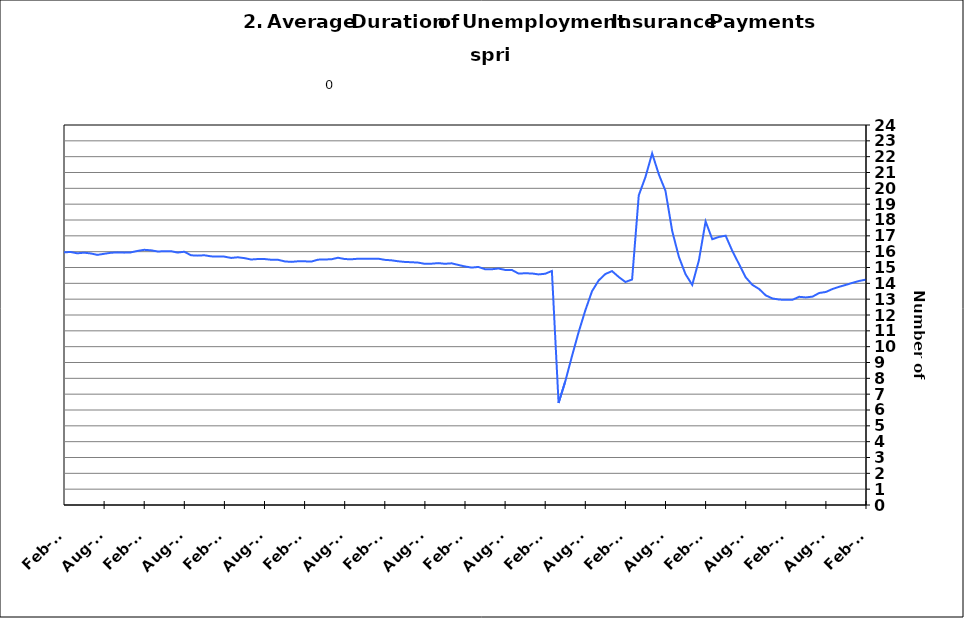
| Category | Average Duration |
|---|---|
| 1995-01-31 | 14.777 |
| 1995-02-28 | 14.761 |
| 1995-03-31 | 14.672 |
| 1995-04-30 | 14.601 |
| 1995-05-31 | 14.598 |
| 1995-06-30 | 14.51 |
| 1995-07-31 | 14.501 |
| 1995-08-31 | 14.41 |
| 1995-09-30 | 14.373 |
| 1995-10-31 | 14.393 |
| 1995-11-30 | 14.306 |
| 1995-12-31 | 14.23 |
| 1996-01-15 | 14.277 |
| 1996-02-15 | 14.204 |
| 1996-03-15 | 14.195 |
| 1996-04-15 | 14.116 |
| 1996-05-15 | 14.187 |
| 1996-06-15 | 14.214 |
| 1996-07-15 | 14.172 |
| 1996-08-15 | 14.174 |
| 1996-09-15 | 14.312 |
| 1996-10-15 | 14.308 |
| 1996-11-15 | 14.344 |
| 1996-12-15 | 14.461 |
| 1997-01-15 | 14.383 |
| 1997-02-15 | 14.413 |
| 1997-03-15 | 14.473 |
| 1997-04-15 | 14.518 |
| 1997-05-31 | 14.455 |
| 1997-06-30 | 14.38 |
| 1997-07-31 | 14.331 |
| 1997-08-31 | 14.279 |
| 1997-09-30 | 14.129 |
| 1997-10-31 | 14.07 |
| 1997-11-30 | 14.067 |
| 1997-12-31 | 13.993 |
| 1998-01-31 | 14.035 |
| 1998-02-28 | 14.047 |
| 1998-03-31 | 13.866 |
| 1998-04-30 | 13.764 |
| 1998-05-31 | 13.76 |
| 1998-06-30 | 13.675 |
| 1998-07-31 | 13.636 |
| 1998-08-31 | 13.558 |
| 1998-09-30 | 13.537 |
| 1998-10-31 | 13.462 |
| 1998-11-30 | 13.294 |
| 1998-12-31 | 13.16 |
| 1999-01-31 | 13.192 |
| 1999-02-28 | 13.297 |
| 1999-03-31 | 13.402 |
| 1999-04-30 | 13.443 |
| 1999-05-31 | 13.587 |
| 1999-06-30 | 13.74 |
| 1999-07-31 | 13.61 |
| 1999-08-31 | 13.717 |
| 1999-09-30 | 13.836 |
| 1999-10-31 | 14.032 |
| 1999-11-30 | 14.175 |
| 1999-12-31 | 14.303 |
| 2000-01-31 | 14.429 |
| 2000-02-29 | 14.376 |
| 2000-03-31 | 14.318 |
| 2000-04-30 | 14.352 |
| 2000-05-31 | 14.265 |
| 2000-06-30 | 14.174 |
| 2000-07-31 | 14.386 |
| 2000-08-31 | 14.362 |
| 2000-09-30 | 14.238 |
| 2000-10-31 | 14.236 |
| 2000-11-30 | 14.118 |
| 2000-12-31 | 14.004 |
| 2001-01-31 | 13.831 |
| 2001-02-28 | 13.708 |
| 2001-03-31 | 13.528 |
| 2001-04-30 | 13.376 |
| 2001-05-31 | 13.219 |
| 2001-06-30 | 13.171 |
| 2001-07-31 | 13.214 |
| 2001-08-31 | 13.157 |
| 2001-09-30 | 13.341 |
| 2001-10-31 | 13.178 |
| 2001-11-30 | 13.143 |
| 2001-12-31 | 13.4 |
| 2002-01-31 | 13.658 |
| 2002-02-28 | 13.952 |
| 2002-03-31 | 14.4 |
| 2002-04-30 | 14.946 |
| 2002-05-31 | 15.299 |
| 2002-06-30 | 15.677 |
| 2002-07-31 | 15.88 |
| 2002-08-31 | 16.087 |
| 2002-09-30 | 16.301 |
| 2002-10-31 | 16.624 |
| 2002-11-30 | 17.004 |
| 2002-12-31 | 17.229 |
| 2003-01-31 | 17.337 |
| 2003-02-28 | 17.359 |
| 2003-03-31 | 17.387 |
| 2003-04-30 | 17.118 |
| 2003-05-31 | 17.133 |
| 2003-06-30 | 17.187 |
| 2003-07-31 | 17.249 |
| 2003-08-31 | 17.486 |
| 2003-09-30 | 17.575 |
| 2003-10-31 | 17.651 |
| 2003-11-30 | 17.867 |
| 2003-12-31 | 17.897 |
| 2004-01-31 | 17.88 |
| 2004-02-29 | 17.995 |
| 2004-03-31 | 17.897 |
| 2004-04-30 | 17.828 |
| 2004-05-31 | 17.883 |
| 2004-06-30 | 17.577 |
| 2004-07-31 | 17.405 |
| 2004-08-31 | 17.207 |
| 2004-09-30 | 16.913 |
| 2004-10-31 | 16.869 |
| 2004-11-30 | 16.518 |
| 2004-12-31 | 16.342 |
| 2005-01-31 | 16.376 |
| 2005-02-28 | 16.223 |
| 2005-03-31 | 16.07 |
| 2005-04-30 | 15.951 |
| 2005-05-31 | 15.826 |
| 2005-06-30 | 15.815 |
| 2005-07-31 | 15.99 |
| 2005-08-31 | 15.796 |
| 2005-09-30 | 15.736 |
| 2005-10-31 | 15.703 |
| 2005-11-30 | 15.697 |
| 2005-12-31 | 15.583 |
| 2006-01-31 | 15.497 |
| 2006-02-28 | 15.415 |
| 2006-03-31 | 15.399 |
| 2006-04-30 | 15.663 |
| 2006-05-31 | 15.487 |
| 2006-06-30 | 15.333 |
| 2006-07-31 | 15.144 |
| 2006-08-31 | 14.91 |
| 2006-09-30 | 14.845 |
| 2006-10-31 | 14.766 |
| 2006-11-30 | 14.588 |
| 2006-12-31 | 14.585 |
| 2007-01-31 | 14.485 |
| 2007-02-28 | 14.412 |
| 2007-03-31 | 14.336 |
| 2007-04-30 | 14.26 |
| 2007-05-31 | 14.261 |
| 2007-06-30 | 14.479 |
| 2007-07-30 | 14.599 |
| 2007-08-31 | 14.843 |
| 2007-09-30 | 14.99 |
| 2007-10-31 | 15.008 |
| 2007-11-15 | 15.072 |
| 2007-12-15 09:36:00 | 15.095 |
| 2008-01-14 19:12:00 | 15.068 |
| 2008-02-14 04:48:00 | 15.026 |
| 2008-03-15 14:24:00 | 15.176 |
| 2008-04-15 | 15.005 |
| 2008-05-15 09:36:00 | 15.047 |
| 2008-06-14 19:12:00 | 15.073 |
| 2008-07-15 04:48:00 | 15.03 |
| 2008-08-14 14:24:00 | 15.17 |
| 2008-09-14 | 15.292 |
| 2008-10-14 09:36:00 | 15.161 |
| 2008-11-13 19:12:00 | 14.99 |
| 2008-12-14 04:48:00 | 14.905 |
| 2009-01-13 14:24:00 | 14.874 |
| 2009-02-13 | 14.935 |
| 2009-03-15 09:36:00 | 15.173 |
| 2009-04-14 19:12:00 | 15.519 |
| 2009-05-15 04:48:00 | 15.914 |
| 2009-06-14 14:24:00 | 16.348 |
| 2009-07-15 | 16.557 |
| 2009-08-14 09:36:00 | 16.984 |
| 2009-09-13 19:12:00 | 17.215 |
| 2009-10-14 04:48:00 | 17.535 |
| 2009-11-13 14:24:00 | 18.106 |
| 2009-12-14 | 18.54 |
| 2010-01-13 09:36:00 | 18.944 |
| 2010-02-12 19:12:00 | 19.336 |
| 2010-03-15 04:48:00 | 19.768 |
| 2010-04-14 14:24:00 | 19.926 |
| 2010-05-15 | 19.977 |
| 2010-06-14 09:36:00 | 19.94 |
| 2010-07-14 19:12:00 | 19.962 |
| 2010-08-14 04:48:00 | 19.819 |
| 2010-09-13 14:24:00 | 19.804 |
| 2010-10-14 | 19.667 |
| 2010-11-13 09:36:00 | 19.551 |
| 2010-12-13 19:12:00 | 19.477 |
| 2011-01-13 04:48:00 | 19.292 |
| 2011-02-12 14:24:00 | 19.125 |
| 2011-03-15 | 18.81 |
| 2011-04-14 09:36:00 | 18.639 |
| 2011-05-14 19:12:00 | 18.54 |
| 2011-06-14 04:48:00 | 18.288 |
| 2011-07-14 14:24:00 | 18.091 |
| 2011-08-14 | 17.932 |
| 2011-09-13 09:36:00 | 17.786 |
| 2011-10-13 19:12:00 | 17.884 |
| 2011-11-13 04:48:00 | 17.646 |
| 2011-12-13 14:24:00 | 17.586 |
| 2012-01-13 | 17.54 |
| 2012-02-12 09:36:00 | 17.456 |
| 2012-03-13 19:12:00 | 17.368 |
| 2012-04-13 04:48:00 | 17.381 |
| 2012-05-13 14:24:00 | 17.203 |
| 2012-06-13 | 17.23 |
| 2012-07-13 09:36:00 | 17.342 |
| 2012-08-12 19:12:00 | 17.231 |
| 2012-09-12 04:48:00 | 17.333 |
| 2012-10-12 14:24:00 | 17.279 |
| 2012-11-12 | 17.187 |
| 2012-12-12 09:36:00 | 17.098 |
| 2013-01-11 19:12:00 | 16.896 |
| 2013-02-11 04:48:00 | 16.83 |
| 2013-03-13 14:24:00 | 16.718 |
| 2013-04-13 | 16.663 |
| 2013-05-13 09:36:00 | 16.59 |
| 2013-06-12 19:12:00 | 16.673 |
| 2013-07-13 04:48:00 | 16.659 |
| 2013-08-12 14:24:00 | 16.466 |
| 2013-09-12 | 16.311 |
| 2013-10-12 09:36:00 | 16.144 |
| 2013-11-11 19:12:00 | 16.13 |
| 2013-12-12 04:48:00 | 16.048 |
| 2014-01-11 14:24:00 | 16.033 |
| 2014-02-11 | 15.962 |
| 2014-03-13 09:36:00 | 15.979 |
| 2014-04-12 19:12:00 | 15.897 |
| 2014-05-13 04:48:00 | 15.936 |
| 2014-06-12 14:24:00 | 15.888 |
| 2014-07-13 | 15.797 |
| 2014-08-12 09:36:00 | 15.865 |
| 2014-09-11 19:12:00 | 15.93 |
| 2014-10-12 04:48:00 | 15.956 |
| 2014-11-11 14:24:00 | 15.939 |
| 2014-12-12 | 15.955 |
| 2015-01-11 09:36:00 | 16.046 |
| 2015-02-10 19:12:00 | 16.117 |
| 2015-03-13 04:48:00 | 16.086 |
| 2015-04-12 14:24:00 | 16.014 |
| 2015-05-13 | 16.023 |
| 2015-06-12 09:36:00 | 16.033 |
| 2015-07-12 19:12:00 | 15.941 |
| 2015-08-12 04:48:00 | 15.997 |
| 2015-09-11 14:24:00 | 15.772 |
| 2015-10-12 | 15.749 |
| 2015-11-11 09:36:00 | 15.773 |
| 2015-12-11 19:12:00 | 15.704 |
| 2016-01-11 04:48:00 | 15.692 |
| 2016-02-10 14:24:00 | 15.687 |
| 2016-03-12 | 15.604 |
| 2016-04-11 09:36:00 | 15.646 |
| 2016-05-11 19:12:00 | 15.592 |
| 2016-06-11 04:48:00 | 15.504 |
| 2016-07-11 14:24:00 | 15.535 |
| 2016-08-11 | 15.535 |
| 2016-09-10 09:36:00 | 15.49 |
| 2016-10-10 19:12:00 | 15.491 |
| 2016-11-10 04:48:00 | 15.386 |
| 2016-12-10 14:24:00 | 15.355 |
| 2017-01-10 | 15.392 |
| 2017-02-09 09:36:00 | 15.391 |
| 2017-03-11 19:12:00 | 15.372 |
| 2017-04-11 04:48:00 | 15.495 |
| 2017-05-11 14:24:00 | 15.509 |
| 2017-06-11 | 15.518 |
| 2017-07-11 09:36:00 | 15.616 |
| 2017-08-10 19:12:00 | 15.534 |
| 2017-09-10 04:48:00 | 15.52 |
| 2017-10-10 14:24:00 | 15.554 |
| 2017-11-10 | 15.552 |
| 2017-12-10 09:36:00 | 15.547 |
| 2018-01-09 19:12:00 | 15.558 |
| 2018-02-09 04:48:00 | 15.483 |
| 2018-03-11 14:24:00 | 15.454 |
| 2018-04-11 | 15.393 |
| 2018-05-11 09:36:00 | 15.352 |
| 2018-06-10 19:12:00 | 15.333 |
| 2018-07-11 04:48:00 | 15.308 |
| 2018-08-10 14:24:00 | 15.231 |
| 2018-09-10 | 15.241 |
| 2018-10-10 09:36:00 | 15.277 |
| 2018-11-09 19:12:00 | 15.234 |
| 2018-12-10 04:48:00 | 15.264 |
| 2019-01-09 14:24:00 | 15.161 |
| 2019-02-09 | 15.064 |
| 2019-03-11 09:36:00 | 14.995 |
| 2019-04-10 19:12:00 | 15.036 |
| 2019-05-11 04:48:00 | 14.892 |
| 2019-06-10 14:24:00 | 14.889 |
| 2019-07-11 | 14.937 |
| 2019-08-10 09:36:00 | 14.848 |
| 2019-09-09 19:12:00 | 14.848 |
| 2019-10-10 04:48:00 | 14.621 |
| 2019-11-09 14:24:00 | 14.633 |
| 2019-12-10 | 14.625 |
| 2020-01-09 09:36:00 | 14.564 |
| 2020-02-08 19:12:00 | 14.605 |
| 2020-03-10 04:48:00 | 14.78 |
| 2020-04-09 14:24:00 | 6.442 |
| 2020-05-10 | 7.803 |
| 2020-06-09 09:36:00 | 9.393 |
| 2020-07-09 19:12:00 | 10.916 |
| 2020-08-09 04:48:00 | 12.288 |
| 2020-09-08 14:24:00 | 13.497 |
| 2020-10-09 | 14.182 |
| 2020-11-08 09:36:00 | 14.588 |
| 2020-12-08 19:12:00 | 14.772 |
| 2021-01-08 04:48:00 | 14.403 |
| 2021-02-07 14:24:00 | 14.084 |
| 2021-03-10 | 14.241 |
| 2021-04-09 09:36:00 | 19.558 |
| 2021-05-09 19:12:00 | 20.714 |
| 2021-06-09 04:48:00 | 22.207 |
| 2021-07-09 14:24:00 | 20.883 |
| 2021-08-09 | 19.835 |
| 2021-09-08 09:36:00 | 17.307 |
| 2021-10-08 19:12:00 | 15.672 |
| 2021-11-08 04:48:00 | 14.574 |
| 2021-12-08 14:24:00 | 13.901 |
| 2022-01-08 | 15.456 |
| 2022-02-07 09:36:00 | 17.909 |
| 2022-03-09 19:12:00 | 16.786 |
| 2022-04-09 04:48:00 | 16.931 |
| 2022-05-09 14:24:00 | 17.01 |
| 2022-06-09 | 16.045 |
| 2022-07-09 09:36:00 | 15.215 |
| 2022-08-08 19:12:00 | 14.379 |
| 2022-09-08 04:48:00 | 13.902 |
| 2022-10-08 14:24:00 | 13.644 |
| 2022-11-08 | 13.24 |
| 2022-12-08 09:36:00 | 13.043 |
| 2023-01-07 19:12:00 | 12.977 |
| 2023-02-07 04:48:00 | 12.956 |
| 2023-03-09 14:24:00 | 12.961 |
| 2023-04-09 | 13.15 |
| 2023-05-09 09:36:00 | 13.11 |
| 2023-06-08 19:12:00 | 13.161 |
| 2023-07-09 04:48:00 | 13.39 |
| 2023-08-08 14:24:00 | 13.455 |
| 2023-09-08 | 13.645 |
| 2023-10-08 09:36:00 | 13.783 |
| 2023-11-07 19:12:00 | 13.904 |
| 2023-12-08 04:48:00 | 14.035 |
| 2024-01-07 14:24:00 | 14.153 |
| 2024-02-07 | 14.234 |